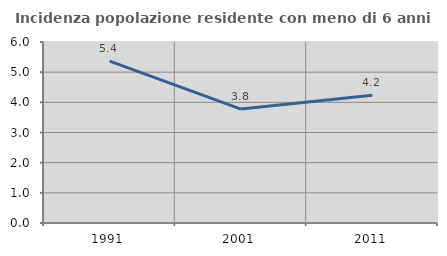
| Category | Incidenza popolazione residente con meno di 6 anni |
|---|---|
| 1991.0 | 5.365 |
| 2001.0 | 3.777 |
| 2011.0 | 4.235 |